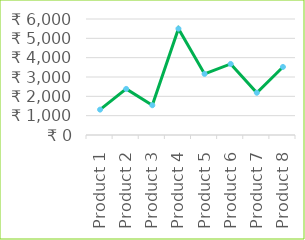
| Category | Series 1 |
|---|---|
| Product 1 | 1312.5 |
| Product 2 | 2383.75 |
| Product 3 | 1540 |
| Product 4 | 5500 |
| Product 5 | 3160 |
| Product 6 | 3675 |
| Product 7 | 2185 |
| Product 8 | 3520 |